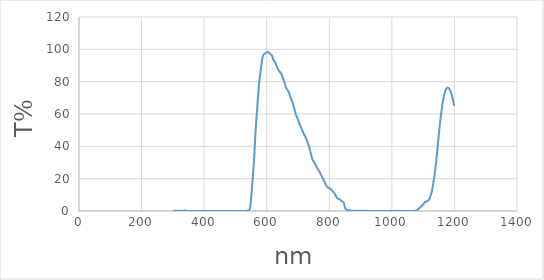
| Category | Series 0 |
|---|---|
| 1200.0 | 65.11 |
| 1199.0 | 65.62 |
| 1198.0 | 66.32 |
| 1197.0 | 67.18 |
| 1196.0 | 68.12 |
| 1195.0 | 69.04 |
| 1194.0 | 69.89 |
| 1193.0 | 70.63 |
| 1192.0 | 71.29 |
| 1191.0 | 71.99 |
| 1190.0 | 72.64 |
| 1189.0 | 73.22 |
| 1188.0 | 73.76 |
| 1187.0 | 74.23 |
| 1186.0 | 74.65 |
| 1185.0 | 75.03 |
| 1184.0 | 75.36 |
| 1183.0 | 75.67 |
| 1182.0 | 75.89 |
| 1181.0 | 76.07 |
| 1180.0 | 76.21 |
| 1179.0 | 76.29 |
| 1178.0 | 76.28 |
| 1177.0 | 76.23 |
| 1176.0 | 76.1 |
| 1175.0 | 75.88 |
| 1174.0 | 75.6 |
| 1173.0 | 75.25 |
| 1172.0 | 74.83 |
| 1171.0 | 74.33 |
| 1170.0 | 73.76 |
| 1169.0 | 73.14 |
| 1168.0 | 72.42 |
| 1167.0 | 71.64 |
| 1166.0 | 70.75 |
| 1165.0 | 69.78 |
| 1164.0 | 68.75 |
| 1163.0 | 67.67 |
| 1162.0 | 66.47 |
| 1161.0 | 65.16 |
| 1160.0 | 63.8 |
| 1159.0 | 62.39 |
| 1158.0 | 60.92 |
| 1157.0 | 59.4 |
| 1156.0 | 57.81 |
| 1155.0 | 56.18 |
| 1154.0 | 54.51 |
| 1153.0 | 52.75 |
| 1152.0 | 50.9 |
| 1151.0 | 48.96 |
| 1150.0 | 47.02 |
| 1149.0 | 45.08 |
| 1148.0 | 43.12 |
| 1147.0 | 41.13 |
| 1146.0 | 39.15 |
| 1145.0 | 37.17 |
| 1144.0 | 35.2 |
| 1143.0 | 33.27 |
| 1142.0 | 31.35 |
| 1141.0 | 29.5 |
| 1140.0 | 27.76 |
| 1139.0 | 26.09 |
| 1138.0 | 24.53 |
| 1137.0 | 23.05 |
| 1136.0 | 21.64 |
| 1135.0 | 20.29 |
| 1134.0 | 19.02 |
| 1133.0 | 17.79 |
| 1132.0 | 16.61 |
| 1131.0 | 15.46 |
| 1130.0 | 14.38 |
| 1129.0 | 13.39 |
| 1128.0 | 12.46 |
| 1127.0 | 11.62 |
| 1126.0 | 10.86 |
| 1125.0 | 10.15 |
| 1124.0 | 9.5 |
| 1123.0 | 8.92 |
| 1122.0 | 8.39 |
| 1121.0 | 7.92 |
| 1120.0 | 7.53 |
| 1119.0 | 7.2 |
| 1118.0 | 6.94 |
| 1117.0 | 6.73 |
| 1116.0 | 6.53 |
| 1115.0 | 6.37 |
| 1114.0 | 6.23 |
| 1113.0 | 6.13 |
| 1112.0 | 6.06 |
| 1111.0 | 6 |
| 1110.0 | 5.91 |
| 1109.0 | 5.82 |
| 1108.0 | 5.69 |
| 1107.0 | 5.56 |
| 1106.0 | 5.37 |
| 1105.0 | 5.17 |
| 1104.0 | 4.96 |
| 1103.0 | 4.74 |
| 1102.0 | 4.52 |
| 1101.0 | 4.29 |
| 1100.0 | 4.06 |
| 1099.0 | 3.84 |
| 1098.0 | 3.64 |
| 1097.0 | 3.46 |
| 1096.0 | 3.27 |
| 1095.0 | 3.09 |
| 1094.0 | 2.9 |
| 1093.0 | 2.73 |
| 1092.0 | 2.55 |
| 1091.0 | 2.36 |
| 1090.0 | 2.19 |
| 1089.0 | 2.02 |
| 1088.0 | 1.84 |
| 1087.0 | 1.67 |
| 1086.0 | 1.51 |
| 1085.0 | 1.35 |
| 1084.0 | 1.19 |
| 1083.0 | 1.04 |
| 1082.0 | 0.91 |
| 1081.0 | 0.76 |
| 1080.0 | 0.62 |
| 1079.0 | 0.49 |
| 1078.0 | 0.37 |
| 1077.0 | 0.27 |
| 1076.0 | 0.2 |
| 1075.0 | 0.14 |
| 1074.0 | 0.09 |
| 1073.0 | 0.06 |
| 1072.0 | 0.05 |
| 1071.0 | 0.04 |
| 1070.0 | 0.02 |
| 1069.0 | 0.01 |
| 1068.0 | 0.01 |
| 1067.0 | 0.01 |
| 1066.0 | 0.02 |
| 1065.0 | 0.02 |
| 1064.0 | 0.03 |
| 1063.0 | 0.03 |
| 1062.0 | 0.02 |
| 1061.0 | 0.02 |
| 1060.0 | 0.01 |
| 1059.0 | 0.01 |
| 1058.0 | 0.01 |
| 1057.0 | 0.02 |
| 1056.0 | 0.01 |
| 1055.0 | 0.03 |
| 1054.0 | 0.03 |
| 1053.0 | 0.03 |
| 1052.0 | 0.02 |
| 1051.0 | 0.01 |
| 1050.0 | 0.02 |
| 1049.0 | 0.02 |
| 1048.0 | 0.01 |
| 1047.0 | 0.01 |
| 1046.0 | 0.02 |
| 1045.0 | 0.02 |
| 1044.0 | 0.02 |
| 1043.0 | 0.02 |
| 1042.0 | 0.02 |
| 1041.0 | 0.02 |
| 1040.0 | 0.02 |
| 1039.0 | 0.02 |
| 1038.0 | 0.02 |
| 1037.0 | 0.02 |
| 1036.0 | 0.02 |
| 1035.0 | 0.01 |
| 1034.0 | 0 |
| 1033.0 | 0.01 |
| 1032.0 | 0.01 |
| 1031.0 | 0.01 |
| 1030.0 | 0.03 |
| 1029.0 | 0.03 |
| 1028.0 | 0.02 |
| 1027.0 | 0.02 |
| 1026.0 | 0.02 |
| 1025.0 | 0.02 |
| 1024.0 | 0.03 |
| 1023.0 | 0.04 |
| 1022.0 | 0.05 |
| 1021.0 | 0.05 |
| 1020.0 | 0.03 |
| 1019.0 | 0.02 |
| 1018.0 | 0 |
| 1017.0 | 0.01 |
| 1016.0 | 0 |
| 1015.0 | 0.02 |
| 1014.0 | 0.02 |
| 1013.0 | 0.03 |
| 1012.0 | 0.04 |
| 1011.0 | 0.03 |
| 1010.0 | 0.02 |
| 1009.0 | 0.01 |
| 1008.0 | 0 |
| 1007.0 | 0.01 |
| 1006.0 | 0.01 |
| 1005.0 | 0 |
| 1004.0 | 0.02 |
| 1003.0 | 0.03 |
| 1002.0 | 0.02 |
| 1001.0 | 0.02 |
| 1000.0 | 0 |
| 999.0 | 0 |
| 998.0 | 0 |
| 997.0 | 0.02 |
| 996.0 | 0.03 |
| 995.0 | 0.03 |
| 994.0 | 0.03 |
| 993.0 | 0.01 |
| 992.0 | 0.01 |
| 991.0 | 0.01 |
| 990.0 | 0 |
| 989.0 | 0 |
| 988.0 | 0.01 |
| 987.0 | 0.01 |
| 986.0 | 0 |
| 985.0 | 0.01 |
| 984.0 | 0 |
| 983.0 | 0 |
| 982.0 | 0.01 |
| 981.0 | 0.02 |
| 980.0 | 0.03 |
| 979.0 | 0.04 |
| 978.0 | 0.02 |
| 977.0 | 0.01 |
| 976.0 | 0.01 |
| 975.0 | 0.03 |
| 974.0 | 0.03 |
| 973.0 | 0.01 |
| 972.0 | 0.01 |
| 971.0 | 0.02 |
| 970.0 | 0.05 |
| 969.0 | 0.06 |
| 968.0 | 0.04 |
| 967.0 | 0.02 |
| 966.0 | 0.02 |
| 965.0 | 0.03 |
| 964.0 | 0.04 |
| 963.0 | 0.04 |
| 962.0 | 0.03 |
| 961.0 | 0.03 |
| 960.0 | 0.03 |
| 959.0 | 0.03 |
| 958.0 | 0.01 |
| 957.0 | 0.01 |
| 956.0 | 0.01 |
| 955.0 | 0.02 |
| 954.0 | 0.03 |
| 953.0 | 0.03 |
| 952.0 | 0.04 |
| 951.0 | 0.06 |
| 950.0 | 0.08 |
| 949.0 | 0.08 |
| 948.0 | 0.06 |
| 947.0 | 0.04 |
| 946.0 | 0.04 |
| 945.0 | 0.02 |
| 944.0 | 0.02 |
| 943.0 | 0.02 |
| 942.0 | 0.04 |
| 941.0 | 0.07 |
| 940.0 | 0.07 |
| 939.0 | 0.06 |
| 938.0 | 0.04 |
| 937.0 | 0.03 |
| 936.0 | 0.02 |
| 935.0 | 0.01 |
| 934.0 | 0 |
| 933.0 | 0.01 |
| 932.0 | 0.01 |
| 931.0 | 0.01 |
| 930.0 | 0.01 |
| 929.0 | 0.01 |
| 928.0 | 0.01 |
| 927.0 | 0.05 |
| 926.0 | 0.05 |
| 925.0 | 0.06 |
| 924.0 | 0.08 |
| 923.0 | 0.1 |
| 922.0 | 0.1 |
| 921.0 | 0.11 |
| 920.0 | 0.12 |
| 919.0 | 0.1 |
| 918.0 | 0.12 |
| 917.0 | 0.11 |
| 916.0 | 0.08 |
| 915.0 | 0.06 |
| 914.0 | 0.04 |
| 913.0 | 0.06 |
| 912.0 | 0.09 |
| 911.0 | 0.08 |
| 910.0 | 0.09 |
| 909.0 | 0.12 |
| 908.0 | 0.11 |
| 907.0 | 0.1 |
| 906.0 | 0.08 |
| 905.0 | 0.02 |
| 904.0 | 0.06 |
| 903.0 | 0.05 |
| 902.0 | 0.05 |
| 901.0 | 0.08 |
| 900.0 | 0.08 |
| 899.0 | 0.08 |
| 898.0 | 0.09 |
| 897.0 | 0.08 |
| 896.0 | 0.06 |
| 895.0 | 0.09 |
| 894.0 | 0.09 |
| 893.0 | 0.09 |
| 892.0 | 0.09 |
| 891.0 | 0.06 |
| 890.0 | 0.07 |
| 889.0 | 0.12 |
| 888.0 | 0.14 |
| 887.0 | 0.15 |
| 886.0 | 0.13 |
| 885.0 | 0.14 |
| 884.0 | 0.15 |
| 883.0 | 0.07 |
| 882.0 | 0.01 |
| 881.0 | 0.03 |
| 880.0 | 0.01 |
| 879.0 | 0.08 |
| 878.0 | 0.11 |
| 877.0 | 0.09 |
| 876.0 | 0.07 |
| 875.0 | 0.07 |
| 874.0 | 0.06 |
| 873.0 | 0.01 |
| 872.0 | 0.11 |
| 871.0 | 0.16 |
| 870.0 | 0.21 |
| 869.0 | 0.29 |
| 868.0 | 0.37 |
| 867.0 | 0.43 |
| 866.0 | 0.48 |
| 865.0 | 0.48 |
| 864.0 | 0.5 |
| 863.0 | 0.5 |
| 862.0 | 0.5 |
| 861.0 | 0.5 |
| 860.0 | 0.5 |
| 859.0 | 0.49 |
| 858.0 | 0.55 |
| 857.0 | 0.64 |
| 856.0 | 0.8 |
| 855.0 | 0.89 |
| 854.0 | 0.99 |
| 853.0 | 1.06 |
| 852.0 | 1.33 |
| 851.0 | 1.72 |
| 850.0 | 2.3 |
| 849.0 | 2.99 |
| 848.0 | 3.79 |
| 847.0 | 4.52 |
| 846.0 | 5.13 |
| 845.0 | 5.5 |
| 844.0 | 5.69 |
| 843.0 | 5.78 |
| 842.0 | 5.9 |
| 841.0 | 6 |
| 840.0 | 6.12 |
| 839.0 | 6.23 |
| 838.0 | 6.41 |
| 837.0 | 6.6 |
| 836.0 | 6.76 |
| 835.0 | 6.93 |
| 834.0 | 7.06 |
| 833.0 | 7.2 |
| 832.0 | 7.31 |
| 831.0 | 7.41 |
| 830.0 | 7.49 |
| 829.0 | 7.57 |
| 828.0 | 7.67 |
| 827.0 | 7.8 |
| 826.0 | 7.96 |
| 825.0 | 8.12 |
| 824.0 | 8.35 |
| 823.0 | 8.63 |
| 822.0 | 8.91 |
| 821.0 | 9.28 |
| 820.0 | 9.63 |
| 819.0 | 10.01 |
| 818.0 | 10.37 |
| 817.0 | 10.7 |
| 816.0 | 11.02 |
| 815.0 | 11.3 |
| 814.0 | 11.53 |
| 813.0 | 11.76 |
| 812.0 | 12.01 |
| 811.0 | 12.21 |
| 810.0 | 12.44 |
| 809.0 | 12.69 |
| 808.0 | 12.89 |
| 807.0 | 13.11 |
| 806.0 | 13.29 |
| 805.0 | 13.43 |
| 804.0 | 13.59 |
| 803.0 | 13.7 |
| 802.0 | 13.83 |
| 801.0 | 13.93 |
| 800.0 | 14.03 |
| 799.0 | 14.14 |
| 798.0 | 14.25 |
| 797.0 | 14.37 |
| 796.0 | 14.47 |
| 795.0 | 14.65 |
| 794.0 | 14.83 |
| 793.0 | 15.05 |
| 792.0 | 15.31 |
| 791.0 | 15.57 |
| 790.0 | 15.93 |
| 789.0 | 16.28 |
| 788.0 | 16.69 |
| 787.0 | 17.1 |
| 786.0 | 17.52 |
| 785.0 | 17.96 |
| 784.0 | 18.37 |
| 783.0 | 18.82 |
| 782.0 | 19.2 |
| 781.0 | 19.62 |
| 780.0 | 20.01 |
| 779.0 | 20.37 |
| 778.0 | 20.76 |
| 777.0 | 21.11 |
| 776.0 | 21.48 |
| 775.0 | 21.85 |
| 774.0 | 22.21 |
| 773.0 | 22.6 |
| 772.0 | 23 |
| 771.0 | 23.39 |
| 770.0 | 23.79 |
| 769.0 | 24.18 |
| 768.0 | 24.5 |
| 767.0 | 24.86 |
| 766.0 | 25.16 |
| 765.0 | 25.41 |
| 764.0 | 25.7 |
| 763.0 | 25.95 |
| 762.0 | 26.22 |
| 761.0 | 26.56 |
| 760.0 | 26.94 |
| 759.0 | 27.39 |
| 758.0 | 27.79 |
| 757.0 | 28.2 |
| 756.0 | 28.61 |
| 755.0 | 28.98 |
| 754.0 | 29.3 |
| 753.0 | 29.67 |
| 752.0 | 30 |
| 751.0 | 30.33 |
| 750.0 | 30.67 |
| 749.0 | 30.99 |
| 748.0 | 31.27 |
| 747.0 | 31.59 |
| 746.0 | 32.04 |
| 745.0 | 32.67 |
| 744.0 | 33.28 |
| 743.0 | 34.02 |
| 742.0 | 34.8 |
| 741.0 | 35.61 |
| 740.0 | 36.39 |
| 739.0 | 37.18 |
| 738.0 | 37.92 |
| 737.0 | 38.66 |
| 736.0 | 39.38 |
| 735.0 | 40 |
| 734.0 | 40.58 |
| 733.0 | 41.07 |
| 732.0 | 41.61 |
| 731.0 | 42.19 |
| 730.0 | 42.71 |
| 729.0 | 43.31 |
| 728.0 | 43.85 |
| 727.0 | 44.34 |
| 726.0 | 44.81 |
| 725.0 | 45.23 |
| 724.0 | 45.66 |
| 723.0 | 46.08 |
| 722.0 | 46.48 |
| 721.0 | 46.83 |
| 720.0 | 47.18 |
| 719.0 | 47.55 |
| 718.0 | 47.93 |
| 717.0 | 48.35 |
| 716.0 | 48.73 |
| 715.0 | 49.22 |
| 714.0 | 49.7 |
| 713.0 | 50.11 |
| 712.0 | 50.57 |
| 711.0 | 50.99 |
| 710.0 | 51.48 |
| 709.0 | 52.03 |
| 708.0 | 52.55 |
| 707.0 | 52.97 |
| 706.0 | 53.37 |
| 705.0 | 53.82 |
| 704.0 | 54.31 |
| 703.0 | 54.88 |
| 702.0 | 55.4 |
| 701.0 | 56.02 |
| 700.0 | 56.59 |
| 699.0 | 57.13 |
| 698.0 | 57.59 |
| 697.0 | 57.92 |
| 696.0 | 58.31 |
| 695.0 | 58.78 |
| 694.0 | 59.32 |
| 693.0 | 59.9 |
| 692.0 | 60.54 |
| 691.0 | 61.18 |
| 690.0 | 61.95 |
| 689.0 | 62.73 |
| 688.0 | 63.5 |
| 687.0 | 64.25 |
| 686.0 | 64.9 |
| 685.0 | 65.57 |
| 684.0 | 66.18 |
| 683.0 | 66.72 |
| 682.0 | 67.28 |
| 681.0 | 67.8 |
| 680.0 | 68.27 |
| 679.0 | 68.75 |
| 678.0 | 69.23 |
| 677.0 | 69.68 |
| 676.0 | 70.2 |
| 675.0 | 70.8 |
| 674.0 | 71.42 |
| 673.0 | 72.07 |
| 672.0 | 72.65 |
| 671.0 | 73.14 |
| 670.0 | 73.61 |
| 669.0 | 73.98 |
| 668.0 | 74.32 |
| 667.0 | 74.63 |
| 666.0 | 74.89 |
| 665.0 | 75.15 |
| 664.0 | 75.43 |
| 663.0 | 75.76 |
| 662.0 | 76.17 |
| 661.0 | 76.7 |
| 660.0 | 77.27 |
| 659.0 | 78 |
| 658.0 | 78.7 |
| 657.0 | 79.33 |
| 656.0 | 80.02 |
| 655.0 | 80.59 |
| 654.0 | 81.14 |
| 653.0 | 81.7 |
| 652.0 | 82.21 |
| 651.0 | 82.74 |
| 650.0 | 83.28 |
| 649.0 | 83.76 |
| 648.0 | 84.23 |
| 647.0 | 84.62 |
| 646.0 | 84.93 |
| 645.0 | 85.3 |
| 644.0 | 85.63 |
| 643.0 | 85.8 |
| 642.0 | 86.08 |
| 641.0 | 86.31 |
| 640.0 | 86.53 |
| 639.0 | 86.78 |
| 638.0 | 87.02 |
| 637.0 | 87.31 |
| 636.0 | 87.68 |
| 635.0 | 88.15 |
| 634.0 | 88.62 |
| 633.0 | 89.09 |
| 632.0 | 89.58 |
| 631.0 | 90.03 |
| 630.0 | 90.55 |
| 629.0 | 91.02 |
| 628.0 | 91.41 |
| 627.0 | 91.85 |
| 626.0 | 92.2 |
| 625.0 | 92.47 |
| 624.0 | 92.73 |
| 623.0 | 92.92 |
| 622.0 | 93.27 |
| 621.0 | 93.78 |
| 620.0 | 94.34 |
| 619.0 | 94.93 |
| 618.0 | 95.56 |
| 617.0 | 96.03 |
| 616.0 | 96.35 |
| 615.0 | 96.6 |
| 614.0 | 96.64 |
| 613.0 | 96.8 |
| 612.0 | 96.99 |
| 611.0 | 97.21 |
| 610.0 | 97.41 |
| 609.0 | 97.54 |
| 608.0 | 97.76 |
| 607.0 | 97.89 |
| 606.0 | 98.08 |
| 605.0 | 98.21 |
| 604.0 | 98.38 |
| 603.0 | 98.39 |
| 602.0 | 98.34 |
| 601.0 | 98.28 |
| 600.0 | 98.11 |
| 599.0 | 97.98 |
| 598.0 | 97.89 |
| 597.0 | 97.75 |
| 596.0 | 97.61 |
| 595.0 | 97.49 |
| 594.0 | 97.4 |
| 593.0 | 97.22 |
| 592.0 | 97.03 |
| 591.0 | 96.85 |
| 590.0 | 96.73 |
| 589.0 | 96.44 |
| 588.0 | 95.97 |
| 587.0 | 95.28 |
| 586.0 | 94.3 |
| 585.0 | 93.16 |
| 584.0 | 91.84 |
| 583.0 | 90.3 |
| 582.0 | 88.71 |
| 581.0 | 87.19 |
| 580.0 | 85.72 |
| 579.0 | 84.37 |
| 578.0 | 82.95 |
| 577.0 | 81.45 |
| 576.0 | 79.73 |
| 575.0 | 77.76 |
| 574.0 | 75.45 |
| 573.0 | 72.87 |
| 572.0 | 70.08 |
| 571.0 | 67.24 |
| 570.0 | 64.49 |
| 569.0 | 61.87 |
| 568.0 | 59.32 |
| 567.0 | 56.77 |
| 566.0 | 54.05 |
| 565.0 | 51.11 |
| 564.0 | 47.8 |
| 563.0 | 44.24 |
| 562.0 | 40.55 |
| 561.0 | 36.93 |
| 560.0 | 33.52 |
| 559.0 | 30.42 |
| 558.0 | 27.61 |
| 557.0 | 24.96 |
| 556.0 | 22.39 |
| 555.0 | 19.87 |
| 554.0 | 17.33 |
| 553.0 | 14.76 |
| 552.0 | 12.21 |
| 551.0 | 9.77 |
| 550.0 | 7.47 |
| 549.0 | 5.42 |
| 548.0 | 3.68 |
| 547.0 | 2.34 |
| 546.0 | 1.4 |
| 545.0 | 0.81 |
| 544.0 | 0.52 |
| 543.0 | 0.43 |
| 542.0 | 0.39 |
| 541.0 | 0.38 |
| 540.0 | 0.33 |
| 539.0 | 0.27 |
| 538.0 | 0.21 |
| 537.0 | 0.14 |
| 536.0 | 0.09 |
| 535.0 | 0.05 |
| 534.0 | 0.03 |
| 533.0 | 0.02 |
| 532.0 | 0.02 |
| 531.0 | 0.02 |
| 530.0 | 0.02 |
| 529.0 | 0.02 |
| 528.0 | 0.02 |
| 527.0 | 0.02 |
| 526.0 | 0.02 |
| 525.0 | 0.02 |
| 524.0 | 0.02 |
| 523.0 | 0.02 |
| 522.0 | 0.02 |
| 521.0 | 0.02 |
| 520.0 | 0.02 |
| 519.0 | 0.02 |
| 518.0 | 0.02 |
| 517.0 | 0.02 |
| 516.0 | 0.02 |
| 515.0 | 0.02 |
| 514.0 | 0.03 |
| 513.0 | 0.03 |
| 512.0 | 0.02 |
| 511.0 | 0.02 |
| 510.0 | 0.02 |
| 509.0 | 0.02 |
| 508.0 | 0.02 |
| 507.0 | 0.01 |
| 506.0 | 0.02 |
| 505.0 | 0.02 |
| 504.0 | 0.02 |
| 503.0 | 0.02 |
| 502.0 | 0.02 |
| 501.0 | 0.02 |
| 500.0 | 0.02 |
| 499.0 | 0.02 |
| 498.0 | 0.02 |
| 497.0 | 0.02 |
| 496.0 | 0.01 |
| 495.0 | 0.02 |
| 494.0 | 0.02 |
| 493.0 | 0.02 |
| 492.0 | 0.03 |
| 491.0 | 0.03 |
| 490.0 | 0.03 |
| 489.0 | 0.03 |
| 488.0 | 0.03 |
| 487.0 | 0.03 |
| 486.0 | 0.03 |
| 485.0 | 0.03 |
| 484.0 | 0.03 |
| 483.0 | 0.03 |
| 482.0 | 0.03 |
| 481.0 | 0.03 |
| 480.0 | 0.03 |
| 479.0 | 0.03 |
| 478.0 | 0.02 |
| 477.0 | 0.02 |
| 476.0 | 0.02 |
| 475.0 | 0.02 |
| 474.0 | 0.02 |
| 473.0 | 0.02 |
| 472.0 | 0.02 |
| 471.0 | 0.02 |
| 470.0 | 0.02 |
| 469.0 | 0.02 |
| 468.0 | 0.02 |
| 467.0 | 0.02 |
| 466.0 | 0.02 |
| 465.0 | 0.02 |
| 464.0 | 0.02 |
| 463.0 | 0.02 |
| 462.0 | 0.02 |
| 461.0 | 0.02 |
| 460.0 | 0.02 |
| 459.0 | 0.02 |
| 458.0 | 0.02 |
| 457.0 | 0.03 |
| 456.0 | 0.02 |
| 455.0 | 0.02 |
| 454.0 | 0.02 |
| 453.0 | 0.02 |
| 452.0 | 0.02 |
| 451.0 | 0.02 |
| 450.0 | 0.01 |
| 449.0 | 0.01 |
| 448.0 | 0.01 |
| 447.0 | 0.01 |
| 446.0 | 0.01 |
| 445.0 | 0.01 |
| 444.0 | 0.01 |
| 443.0 | 0.02 |
| 442.0 | 0.02 |
| 441.0 | 0.03 |
| 440.0 | 0.02 |
| 439.0 | 0.03 |
| 438.0 | 0.03 |
| 437.0 | 0.02 |
| 436.0 | 0.02 |
| 435.0 | 0.02 |
| 434.0 | 0.02 |
| 433.0 | 0.02 |
| 432.0 | 0.03 |
| 431.0 | 0.03 |
| 430.0 | 0.02 |
| 429.0 | 0.02 |
| 428.0 | 0.01 |
| 427.0 | 0.01 |
| 426.0 | 0.01 |
| 425.0 | 0.01 |
| 424.0 | 0.01 |
| 423.0 | 0.02 |
| 422.0 | 0.02 |
| 421.0 | 0.02 |
| 420.0 | 0.02 |
| 419.0 | 0.02 |
| 418.0 | 0.02 |
| 417.0 | 0.02 |
| 416.0 | 0.02 |
| 415.0 | 0.02 |
| 414.0 | 0.02 |
| 413.0 | 0.02 |
| 412.0 | 0.02 |
| 411.0 | 0.03 |
| 410.0 | 0.02 |
| 409.0 | 0.02 |
| 408.0 | 0.01 |
| 407.0 | 0.02 |
| 406.0 | 0.02 |
| 405.0 | 0.02 |
| 404.0 | 0.02 |
| 403.0 | 0.02 |
| 402.0 | 0.03 |
| 401.0 | 0.03 |
| 400.0 | 0.02 |
| 399.0 | 0.02 |
| 398.0 | 0.02 |
| 397.0 | 0.02 |
| 396.0 | 0.02 |
| 395.0 | 0.03 |
| 394.0 | 0.04 |
| 393.0 | 0.04 |
| 392.0 | 0.04 |
| 391.0 | 0.04 |
| 390.0 | 0.03 |
| 389.0 | 0.02 |
| 388.0 | 0.02 |
| 387.0 | 0.02 |
| 386.0 | 0.02 |
| 385.0 | 0.03 |
| 384.0 | 0.04 |
| 383.0 | 0.03 |
| 382.0 | 0.03 |
| 381.0 | 0.05 |
| 380.0 | 0.05 |
| 379.0 | 0.05 |
| 378.0 | 0.05 |
| 377.0 | 0.04 |
| 376.0 | 0.03 |
| 375.0 | 0.02 |
| 374.0 | 0.02 |
| 373.0 | 0.03 |
| 372.0 | 0.04 |
| 371.0 | 0.04 |
| 370.0 | 0.04 |
| 369.0 | 0.03 |
| 368.0 | 0.02 |
| 367.0 | 0.02 |
| 366.0 | 0 |
| 365.0 | 0 |
| 364.0 | 0 |
| 363.0 | 0.01 |
| 362.0 | 0.02 |
| 361.0 | 0.02 |
| 360.0 | 0.02 |
| 359.0 | 0.04 |
| 358.0 | 0.05 |
| 357.0 | 0.04 |
| 356.0 | 0.03 |
| 355.0 | 0.02 |
| 354.0 | 0.01 |
| 353.0 | 0.01 |
| 352.0 | 0.02 |
| 351.0 | 0.01 |
| 350.0 | 0.01 |
| 349.0 | 0.01 |
| 348.0 | 0.02 |
| 347.0 | 0.02 |
| 346.0 | 0.04 |
| 345.0 | 0.06 |
| 344.0 | 0.08 |
| 343.0 | 0.2 |
| 342.0 | 0.16 |
| 341.0 | 0.07 |
| 340.0 | 0.25 |
| 339.0 | 0.31 |
| 338.0 | 0.28 |
| 337.0 | 0.25 |
| 336.0 | 0.1 |
| 335.0 | 0.07 |
| 334.0 | 0.13 |
| 333.0 | 0.14 |
| 332.0 | 0.08 |
| 331.0 | 0.19 |
| 330.0 | 0.19 |
| 329.0 | 0.03 |
| 328.0 | 0.13 |
| 327.0 | 0.13 |
| 326.0 | 0.11 |
| 325.0 | 0.1 |
| 324.0 | 0.09 |
| 323.0 | 0.09 |
| 322.0 | 0.16 |
| 321.0 | 0.23 |
| 320.0 | 0.24 |
| 319.0 | 0.14 |
| 318.0 | 0.12 |
| 317.0 | 0.05 |
| 316.0 | 0.04 |
| 315.0 | 0.05 |
| 314.0 | 0.03 |
| 313.0 | 0.01 |
| 312.0 | 0.08 |
| 311.0 | 0.14 |
| 310.0 | 0.12 |
| 309.0 | 0.1 |
| 308.0 | 0.06 |
| 307.0 | 0.11 |
| 306.0 | 0.09 |
| 305.0 | 0.01 |
| 304.0 | 0.01 |
| 303.0 | 0.08 |
| 302.0 | 0.16 |
| 301.0 | 0.16 |
| 300.0 | 0.12 |